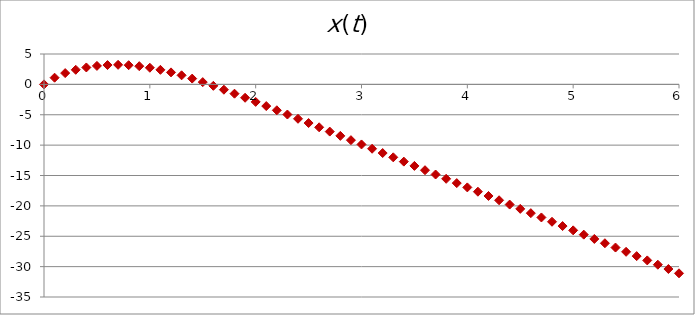
| Category | x |
|---|---|
| 0.0 | 0 |
| 0.1 | 1.1 |
| 0.2 | 1.858 |
| 0.30000000000000004 | 2.401 |
| 0.4 | 2.785 |
| 0.5 | 3.04 |
| 0.6 | 3.181 |
| 0.7 | 3.219 |
| 0.7999999999999999 | 3.156 |
| 0.8999999999999999 | 2.994 |
| 0.9999999999999999 | 2.738 |
| 1.0999999999999999 | 2.394 |
| 1.2 | 1.974 |
| 1.3 | 1.49 |
| 1.4000000000000001 | 0.952 |
| 1.5000000000000002 | 0.372 |
| 1.6000000000000003 | -0.24 |
| 1.7000000000000004 | -0.878 |
| 1.8000000000000005 | -1.534 |
| 1.9000000000000006 | -2.204 |
| 2.0000000000000004 | -2.884 |
| 2.1000000000000005 | -3.572 |
| 2.2000000000000006 | -4.265 |
| 2.3000000000000007 | -4.962 |
| 2.400000000000001 | -5.662 |
| 2.500000000000001 | -6.364 |
| 2.600000000000001 | -7.067 |
| 2.700000000000001 | -7.772 |
| 2.800000000000001 | -8.477 |
| 2.9000000000000012 | -9.183 |
| 3.0000000000000013 | -9.889 |
| 3.1000000000000014 | -10.595 |
| 3.2000000000000015 | -11.302 |
| 3.3000000000000016 | -12.009 |
| 3.4000000000000017 | -12.716 |
| 3.5000000000000018 | -13.422 |
| 3.600000000000002 | -14.129 |
| 3.700000000000002 | -14.836 |
| 3.800000000000002 | -15.543 |
| 3.900000000000002 | -16.251 |
| 4.000000000000002 | -16.958 |
| 4.100000000000001 | -17.665 |
| 4.200000000000001 | -18.372 |
| 4.300000000000001 | -19.079 |
| 4.4 | -19.786 |
| 4.5 | -20.493 |
| 4.6 | -21.2 |
| 4.699999999999999 | -21.907 |
| 4.799999999999999 | -22.614 |
| 4.899999999999999 | -23.321 |
| 4.999999999999998 | -24.029 |
| 5.099999999999998 | -24.736 |
| 5.1999999999999975 | -25.443 |
| 5.299999999999997 | -26.15 |
| 5.399999999999997 | -26.857 |
| 5.4999999999999964 | -27.564 |
| 5.599999999999996 | -28.271 |
| 5.699999999999996 | -28.978 |
| 5.799999999999995 | -29.685 |
| 5.899999999999995 | -30.393 |
| 5.999999999999995 | -31.1 |